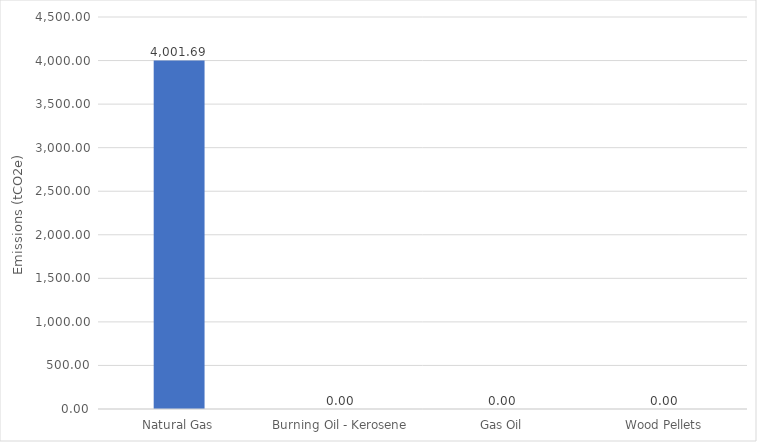
| Category | Emissions
(tCO2e) |
|---|---|
| Natural Gas | 4001.695 |
| Burning Oil - Kerosene | 0 |
| Gas Oil | 0 |
| Wood Pellets | 0 |